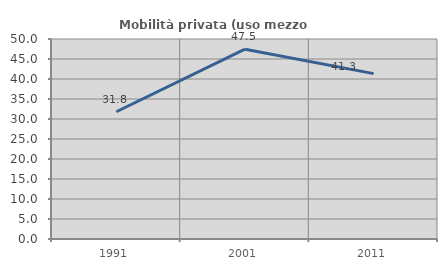
| Category | Mobilità privata (uso mezzo privato) |
|---|---|
| 1991.0 | 31.807 |
| 2001.0 | 47.458 |
| 2011.0 | 41.339 |